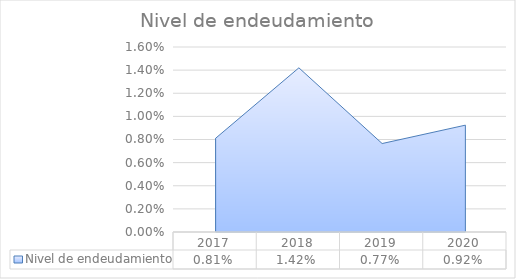
| Category | Nivel de endeudamiento |
|---|---|
| 2017.0 | 0.008 |
| 2018.0 | 0.014 |
| 2019.0 | 0.008 |
| 2020.0 | 0.009 |